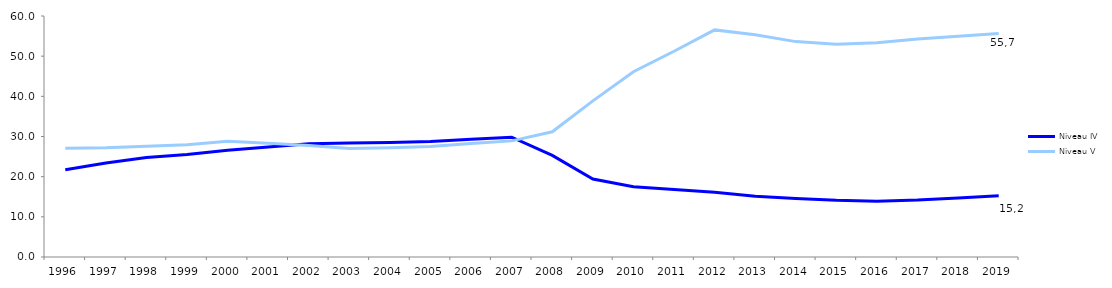
| Category | Niveau IV | Niveau V |
|---|---|---|
| 1996 | 21.718 | 27.088 |
| 1997 | 23.41 | 27.192 |
| 1998 | 24.79 | 27.591 |
| 1999 | 25.546 | 27.963 |
| 2000 | 26.55 | 28.797 |
| 2001 | 27.405 | 28.326 |
| 2002 | 28.216 | 27.76 |
| 2003 | 28.389 | 27.016 |
| 2004 | 28.536 | 27.186 |
| 2005 | 28.732 | 27.507 |
| 2006 | 29.298 | 28.268 |
| 2007 | 29.822 | 28.911 |
| 2008 | 25.292 | 31.184 |
| 2009 | 19.423 | 38.864 |
| 2010 | 17.504 | 46.14 |
| 2011 | 16.812 | 51.224 |
| 2012 | 16.103 | 56.535 |
| 2013 | 15.137 | 55.313 |
| 2014 | 14.583 | 53.621 |
| 2015 | 14.13 | 52.964 |
| 2016 | 13.901 | 53.313 |
| 2017 | 14.164 | 54.267 |
| 2018 | 14.662 | 54.936 |
| 2019 | 15.238 | 55.652 |